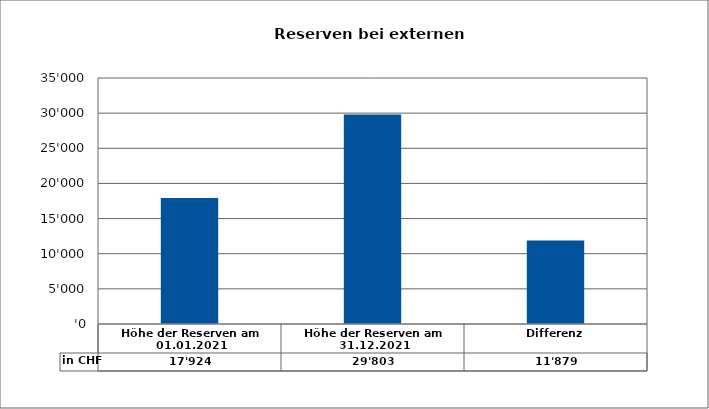
| Category | in CHF |
|---|---|
| Höhe der Reserven am 01.01.2021 | 17924 |
| Höhe der Reserven am 31.12.2021 | 29803 |
| Differenz | 11879 |